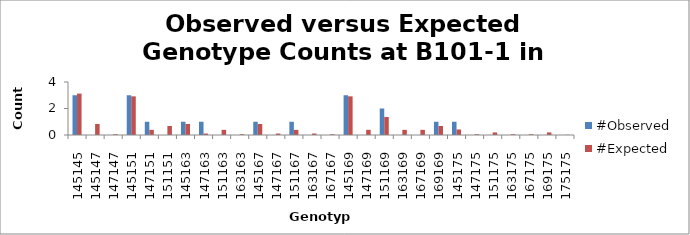
| Category | #Observed | #Expected |
|---|---|---|
| 145145.0 | 3 | 3.125 |
| 145147.0 | 0 | 0.833 |
| 147147.0 | 0 | 0.056 |
| 145151.0 | 3 | 2.917 |
| 147151.0 | 1 | 0.389 |
| 151151.0 | 0 | 0.681 |
| 145163.0 | 1 | 0.833 |
| 147163.0 | 1 | 0.111 |
| 151163.0 | 0 | 0.389 |
| 163163.0 | 0 | 0.056 |
| 145167.0 | 1 | 0.833 |
| 147167.0 | 0 | 0.111 |
| 151167.0 | 1 | 0.389 |
| 163167.0 | 0 | 0.111 |
| 167167.0 | 0 | 0.056 |
| 145169.0 | 3 | 2.917 |
| 147169.0 | 0 | 0.389 |
| 151169.0 | 2 | 1.361 |
| 163169.0 | 0 | 0.389 |
| 167169.0 | 0 | 0.389 |
| 169169.0 | 1 | 0.681 |
| 145175.0 | 1 | 0.417 |
| 147175.0 | 0 | 0.056 |
| 151175.0 | 0 | 0.194 |
| 163175.0 | 0 | 0.056 |
| 167175.0 | 0 | 0.056 |
| 169175.0 | 0 | 0.194 |
| 175175.0 | 0 | 0.014 |